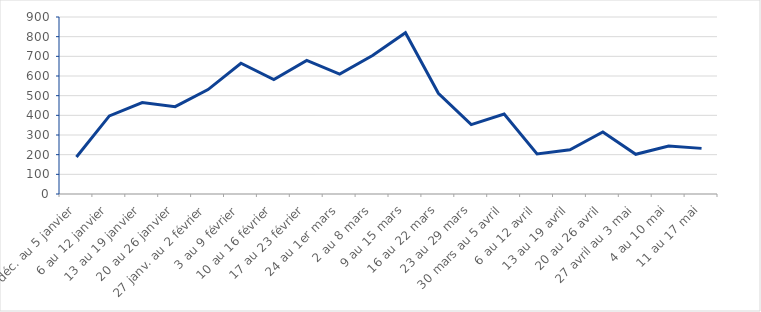
| Category | Series 0 |
|---|---|
| 30 déc. au 5 janvier | 188 |
| 6 au 12 janvier | 397 |
| 13 au 19 janvier | 465 |
| 20 au 26 janvier | 444 |
| 27 janv. au 2 février | 531 |
| 3 au 9 février | 665 |
| 10 au 16 février | 582 |
| 17 au 23 février | 679 |
| 24 au 1er mars | 610 |
| 2 au 8 mars | 704 |
| 9 au 15 mars | 820 |
| 16 au 22 mars | 512 |
| 23 au 29 mars | 353 |
| 30 mars au 5 avril | 407 |
| 6 au 12 avril | 204 |
| 13 au 19 avril | 225 |
| 20 au 26 avril | 315 |
| 27 avril au 3 mai | 202 |
| 4 au 10 mai | 244 |
| 11 au 17 mai | 232 |